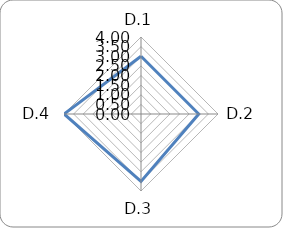
| Category | Series 0 |
|---|---|
| D.1 | 3 |
| D.2 | 3 |
| D.3 | 3.5 |
| D.4 | 4 |